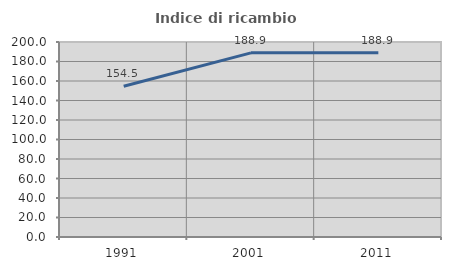
| Category | Indice di ricambio occupazionale  |
|---|---|
| 1991.0 | 154.545 |
| 2001.0 | 188.889 |
| 2011.0 | 188.889 |